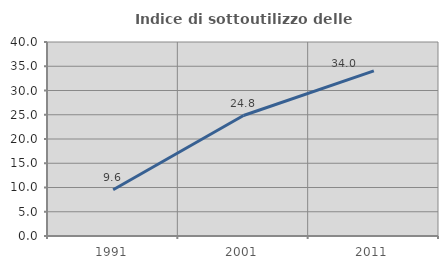
| Category | Indice di sottoutilizzo delle abitazioni  |
|---|---|
| 1991.0 | 9.551 |
| 2001.0 | 24.845 |
| 2011.0 | 34.043 |